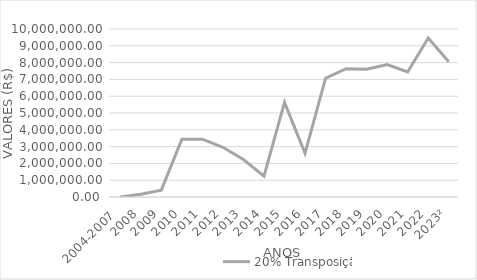
| Category | 20% Transposição |
|---|---|
| 2004-2007  | 0 |
| 2008 | 165551.75 |
| 2009 | 407980.7 |
| 2010 | 3443949.75 |
| 2011 | 3443416.8 |
| 2012 | 2957794.44 |
| 2013 | 2234467.26 |
| 2014 | 1243162.4 |
| 2015 | 5631801.51 |
| 2016 | 2594500.89 |
| 2017 | 7071628.88 |
| 2018 | 7634864.86 |
| 2019 | 7599653.65 |
| 2020 | 7887413.62 |
| 2021 | 7443937.4 |
| 2022 | 9466752.24 |
| 2023² | 8045003.78 |